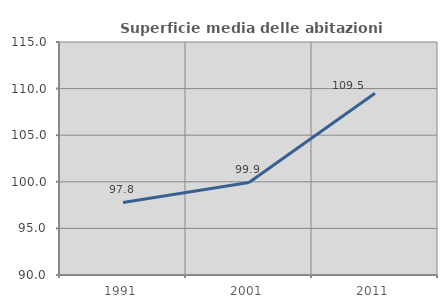
| Category | Superficie media delle abitazioni occupate |
|---|---|
| 1991.0 | 97.79 |
| 2001.0 | 99.926 |
| 2011.0 | 109.499 |